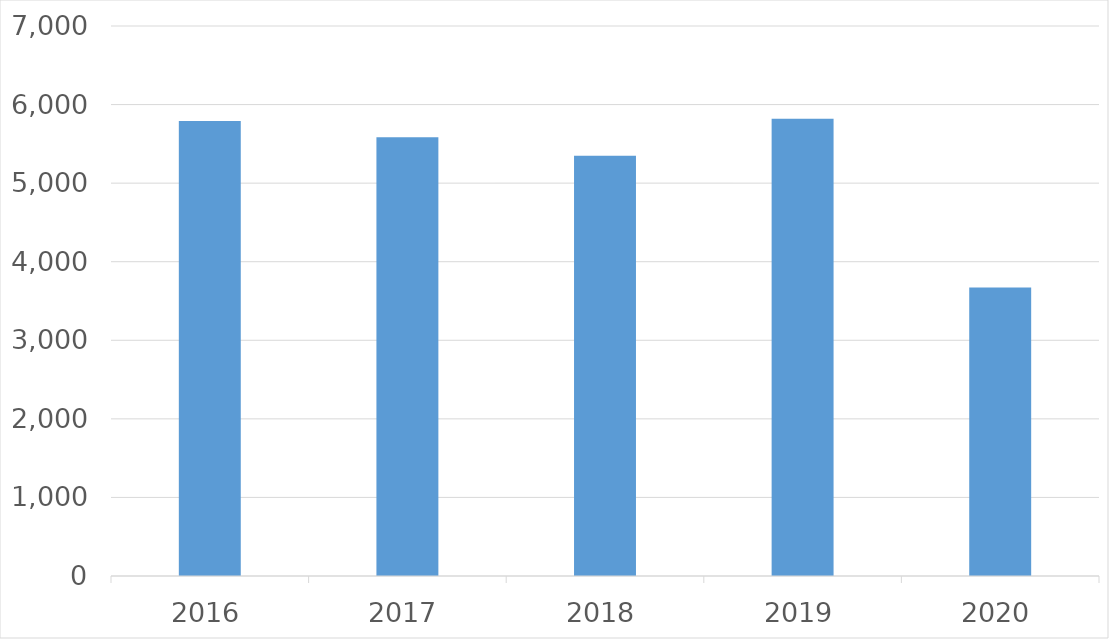
| Category | Series 0 |
|---|---|
| 2016 | 5792 |
| 2017 | 5584 |
| 2018 | 5349 |
| 2019 | 5819 |
| 2020 | 3671 |